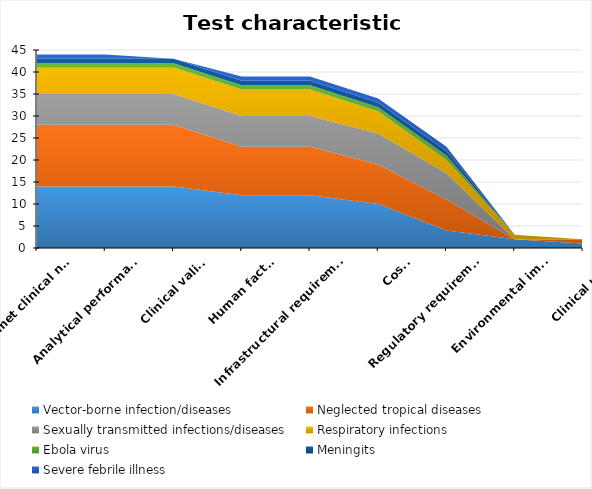
| Category | Vector-borne infection/diseases | Neglected tropical diseases | Sexually transmitted infections/diseases | Respiratory infections | Ebola virus | Meningits | Severe febrile illness |
|---|---|---|---|---|---|---|---|
| Unmet clinical need | 14 | 14 | 7 | 6 | 1 | 1 | 1 |
| Analytical performance | 14 | 14 | 7 | 6 | 1 | 1 | 1 |
| Clinical validity | 14 | 14 | 7 | 6 | 1 | 1 | 0 |
| Human factors | 12 | 11 | 7 | 6 | 1 | 1 | 1 |
| Infrastructural requirements | 12 | 11 | 7 | 6 | 1 | 1 | 1 |
| Costs | 10 | 9 | 7 | 5 | 1 | 1 | 1 |
| Regulatory requirements | 4 | 7 | 6 | 3 | 1 | 1 | 1 |
| Environmental impact | 2 | 0 | 0 | 1 | 0 | 0 | 0 |
| Clinical utility | 1 | 1 | 0 | 0 | 0 | 0 | 0 |